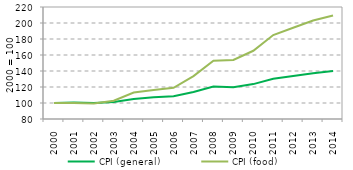
| Category | CPI (general) | CPI (food) |
|---|---|---|
| 2000.0 | 100 | 100 |
| 2001.0 | 100.742 | 100 |
| 2002.0 | 100 | 99.504 |
| 2003.0 | 101.112 | 102.81 |
| 2004.0 | 105.068 | 113.058 |
| 2005.0 | 107.046 | 116.364 |
| 2006.0 | 108.529 | 119.008 |
| 2007.0 | 113.721 | 133.554 |
| 2008.0 | 120.519 | 152.727 |
| 2009.0 | 119.654 | 153.719 |
| 2010.0 | 123.609 | 165.289 |
| 2011.0 | 130.408 | 184.959 |
| 2012.0 | 133.745 | 194.05 |
| 2013.0 | 137.33 | 203.14 |
| 2014.0 | 140.049 | 209.421 |